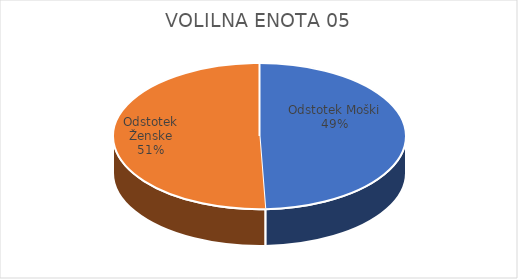
| Category | VOLILNA ENOTA 05 | #REF! | Slovenija skupaj |
|---|---|---|---|
| Odstotek Moški | 26.33 |  | 25.26 |
| Odstotek Ženske | 27 |  | 26.62 |